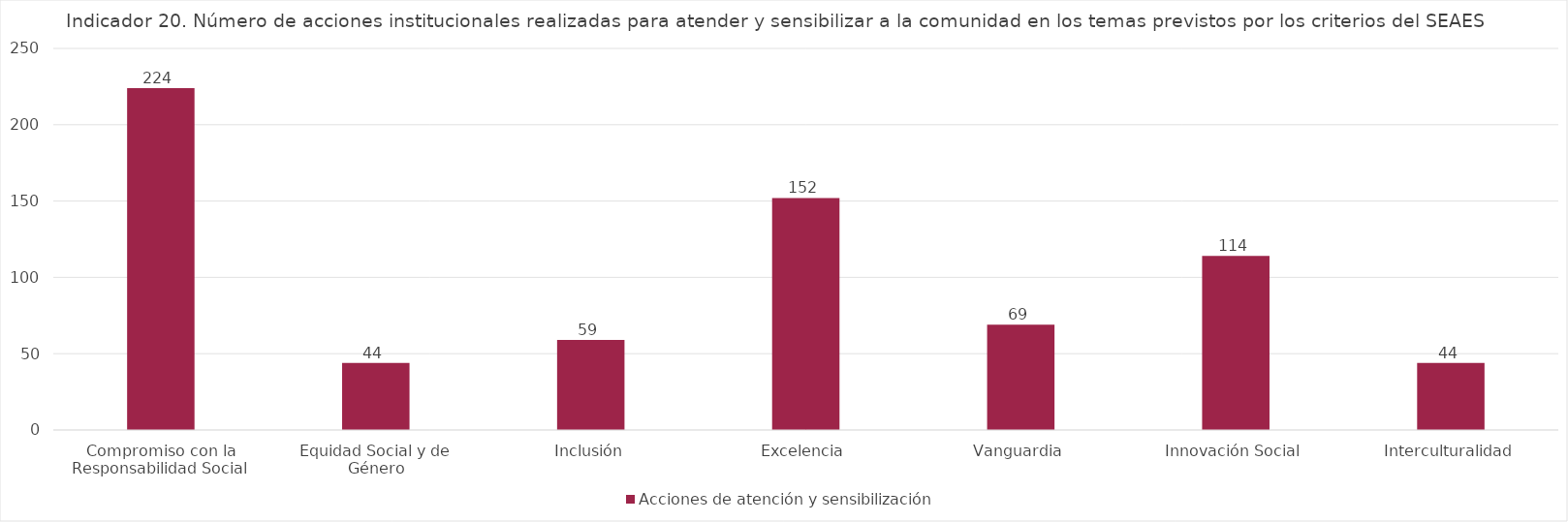
| Category | Acciones de atención y sensibilización |
|---|---|
| Compromiso con la Responsabilidad Social | 224 |
| Equidad Social y de Género | 44 |
| Inclusión | 59 |
| Excelencia | 152 |
| Vanguardia | 69 |
| Innovación Social | 114 |
| Interculturalidad | 44 |